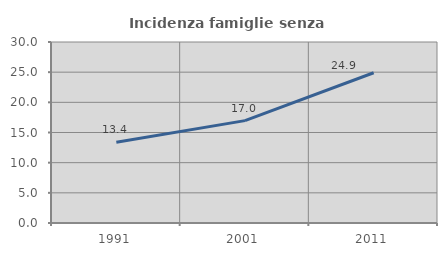
| Category | Incidenza famiglie senza nuclei |
|---|---|
| 1991.0 | 13.384 |
| 2001.0 | 16.965 |
| 2011.0 | 24.9 |